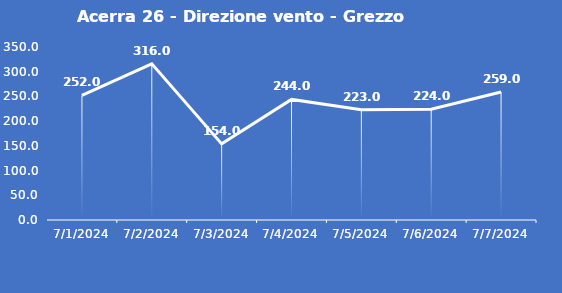
| Category | Acerra 26 - Direzione vento - Grezzo (°N) |
|---|---|
| 7/1/24 | 252 |
| 7/2/24 | 316 |
| 7/3/24 | 154 |
| 7/4/24 | 244 |
| 7/5/24 | 223 |
| 7/6/24 | 224 |
| 7/7/24 | 259 |